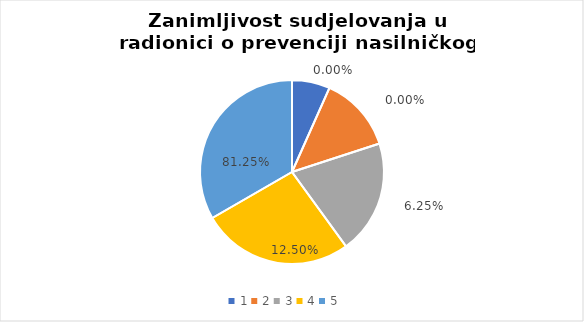
| Category | Series 0 | Series 1 |
|---|---|---|
| 0 | 1 | 0 |
| 1 | 2 | 0 |
| 2 | 3 | 0.062 |
| 3 | 4 | 0.125 |
| 4 | 5 | 0.812 |